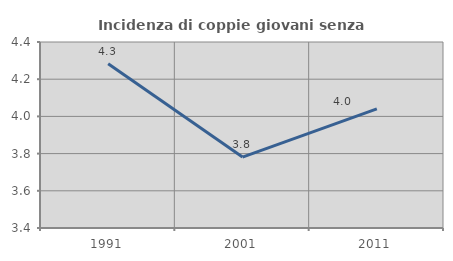
| Category | Incidenza di coppie giovani senza figli |
|---|---|
| 1991.0 | 4.283 |
| 2001.0 | 3.782 |
| 2011.0 | 4.04 |